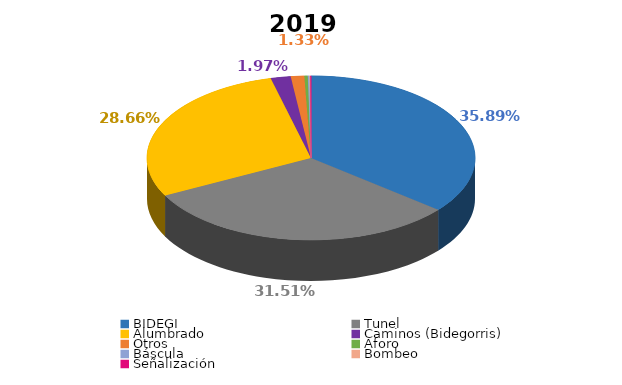
| Category | Consumo electricidad 2019  (kwh/año) |
|---|---|
| BIDEGI | 0.359 |
| Tunel | 0.315 |
| Alumbrado | 0.287 |
| Caminos (Bidegorris) | 0.02 |
| Otros | 0.013 |
| Aforo | 0.003 |
| Báscula | 0.002 |
| Bombeo | 0.001 |
| Señalización | 0 |